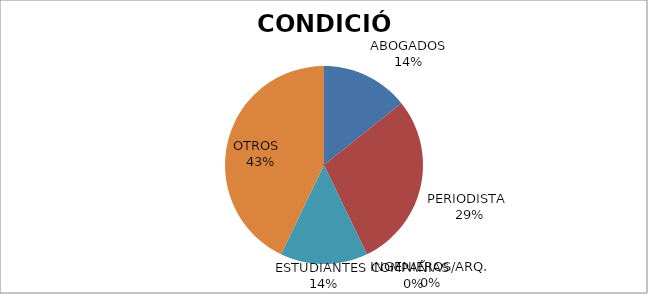
| Category | Series 0 |
|---|---|
| ABOGADOS | 1 |
| PERIODISTA  | 2 |
| COMPAÑIAS  | 0 |
| INGENIEROS/ARQ. | 0 |
| ESTUDIANTES  | 1 |
| OTROS   | 3 |